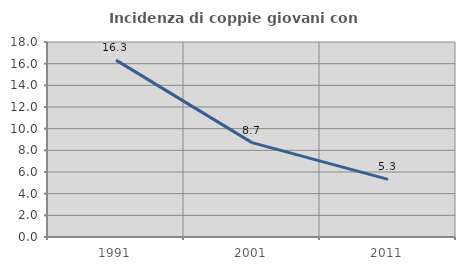
| Category | Incidenza di coppie giovani con figli |
|---|---|
| 1991.0 | 16.324 |
| 2001.0 | 8.712 |
| 2011.0 | 5.315 |